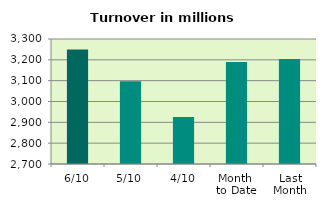
| Category | Series 0 |
|---|---|
| 6/10 | 3249.841 |
| 5/10 | 3097.343 |
| 4/10 | 2925.578 |
| Month 
to Date | 3190.185 |
| Last
Month | 3204.516 |